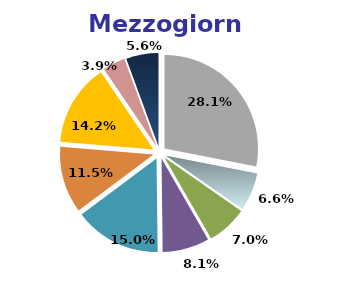
| Category | Mezzogiorno |
|---|---|
| Agricoltura | 28.1 |
| Industria in senso stretto | 6.6 |
| Costruzioni | 7 |
| Commercio e riparazioni | 8.1 |
| Alberghi e ristoranti | 15 |
| Trasporti, comunicazioni etc. | 11.5 |
| P.A., istruzione e sanità | 14.2 |
| Attività svolte da famiglie e convivenze | 3.9 |
| Altri servizi pubblici, sociali e personali | 5.6 |